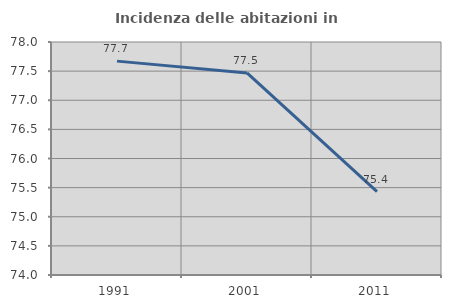
| Category | Incidenza delle abitazioni in proprietà  |
|---|---|
| 1991.0 | 77.672 |
| 2001.0 | 77.47 |
| 2011.0 | 75.433 |